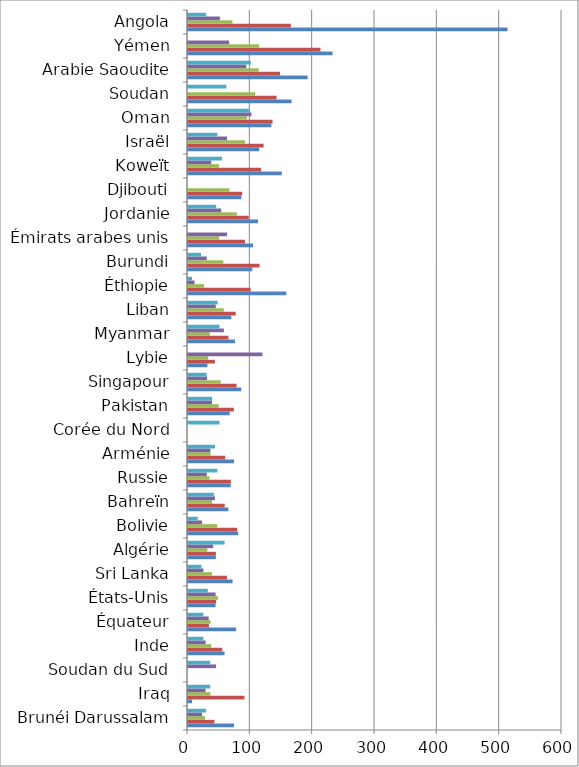
| Category | Series 0 | Series 1 | Series 2 | Series 3 | Series 4 |
|---|---|---|---|---|---|
| Brunéi Darussalam | 73.943 | 42.391 | 27.134 | 22.736 | 28.952 |
| Iraq | 6.639 | 90.487 | 35.867 | 28.172 | 35.688 |
| Soudan du Sud | 0 | 0 | 0 | 45.042 | 35.724 |
| Inde | 58.616 | 54.921 | 37.431 | 28.309 | 24.555 |
| Équateur | 77.18 | 33.478 | 36.218 | 33.228 | 24.633 |
| États-Unis | 44.181 | 45.178 | 48.291 | 44.37 | 31.73 |
| Sri Lanka | 71.479 | 62.523 | 38.321 | 24.821 | 21.572 |
| Algérie | 44.593 | 44.806 | 31.152 | 40.484 | 58.707 |
| Bolivie | 80.494 | 78.942 | 46.775 | 22.596 | 15.608 |
| Bahreïn | 64.824 | 58.977 | 38.74 | 43.204 | 41.556 |
| Russie | 68.554 | 68.722 | 34.386 | 30.122 | 47.109 |
| Arménie | 73.856 | 59.734 | 36.397 | 35.866 | 43.3 |
| Corée du Nord | 0 | 0 | 0 | 0 | 50.416 |
| Pakistan | 66.962 | 73.525 | 49.316 | 38.588 | 38.681 |
| Singapour | 85.434 | 77.911 | 52.417 | 30.592 | 29.96 |
| Lybie | 31.167 | 43.141 | 32.392 | 119.305 | 0 |
| Myanmar | 75.461 | 64.803 | 35.118 | 57.505 | 50.481 |
| Liban | 69.483 | 76.493 | 57.491 | 44.536 | 47.524 |
| Éthiopie | 157.701 | 100.501 | 25.924 | 10.434 | 6.405 |
| Burundi | 103.07 | 114.794 | 56.778 | 30.099 | 20.818 |
| Émirats arabes unis | 104.308 | 91.361 | 49.821 | 62.732 | 0 |
| Jordanie | 112.322 | 97.398 | 78.374 | 53.297 | 45.231 |
| Djibouti | 85.592 | 87.033 | 66.618 | 0 | 0 |
| Koweït | 150.499 | 117.266 | 49.659 | 37.36 | 54.43 |
| Israël | 114.277 | 121.274 | 91.403 | 62.543 | 47.046 |
| Oman | 133.795 | 135.697 | 94.726 | 101.731 | 97.799 |
| Soudan | 166.189 | 142.018 | 107.898 | 0 | 61.589 |
| Arabie Saoudite | 191.882 | 147.617 | 113.576 | 93.559 | 100.543 |
| Yémen | 231.789 | 212.579 | 114.151 | 66.029 | 0 |
| Angola | 512.464 | 165.022 | 71.249 | 51.148 | 29.125 |